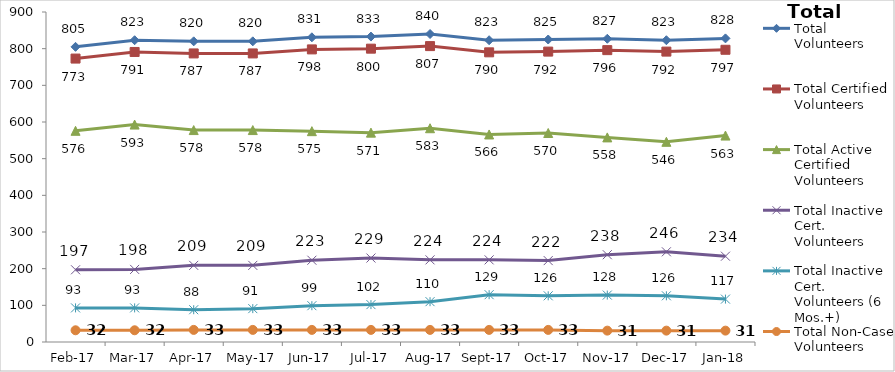
| Category | Total Volunteers | Total Certified Volunteers | Total Active Certified Volunteers | Total Inactive Cert. Volunteers | Total Inactive Cert. Volunteers (6 Mos.+) | Total Non-Case Volunteers |
|---|---|---|---|---|---|---|
| 2017-02-01 | 805 | 773 | 576 | 197 | 93 | 32 |
| 2017-03-01 | 823 | 791 | 593 | 198 | 93 | 32 |
| 2017-04-01 | 820 | 787 | 578 | 209 | 88 | 33 |
| 2017-05-01 | 820 | 787 | 578 | 209 | 91 | 33 |
| 2017-06-01 | 831 | 798 | 575 | 223 | 99 | 33 |
| 2017-07-01 | 833 | 800 | 571 | 229 | 102 | 33 |
| 2017-08-01 | 840 | 807 | 583 | 224 | 110 | 33 |
| 2017-09-01 | 823 | 790 | 566 | 224 | 129 | 33 |
| 2017-10-01 | 825 | 792 | 570 | 222 | 126 | 33 |
| 2017-11-01 | 827 | 796 | 558 | 238 | 128 | 31 |
| 2017-12-01 | 823 | 792 | 546 | 246 | 126 | 31 |
| 2018-01-01 | 828 | 797 | 563 | 234 | 117 | 31 |